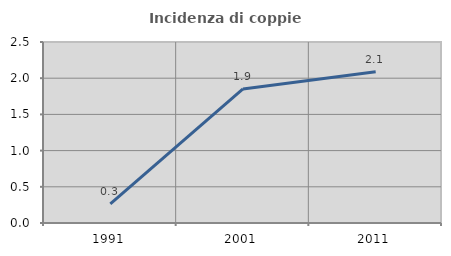
| Category | Incidenza di coppie miste |
|---|---|
| 1991.0 | 0.263 |
| 2001.0 | 1.852 |
| 2011.0 | 2.088 |